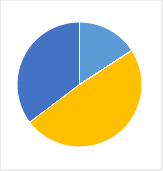
| Category | Series 0 |
|---|---|
| 0 | 0.152 |
| 1 | 0 |
| 2 | 0 |
| 3 | 0.471 |
| 4 | 0.341 |